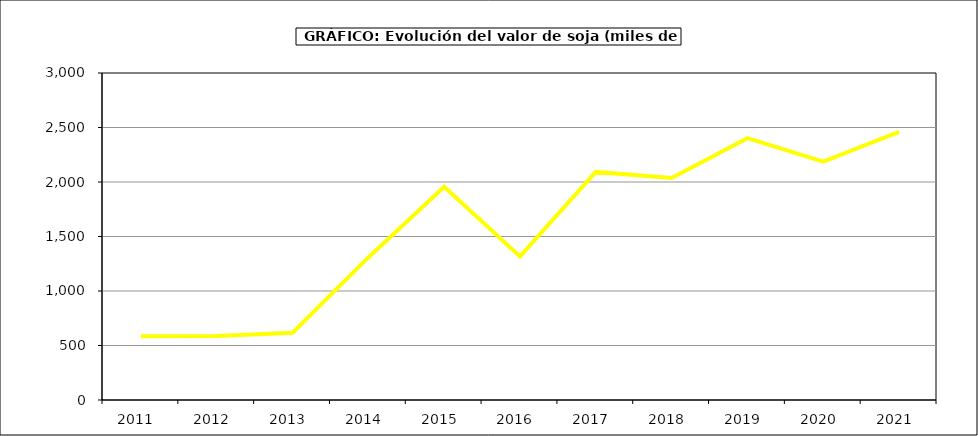
| Category | Valor |
|---|---|
| 2011.0 | 584.814 |
| 2012.0 | 588.253 |
| 2013.0 | 616.743 |
| 2014.0 | 1308.04 |
| 2015.0 | 1956 |
| 2016.0 | 1317 |
| 2017.0 | 2092.786 |
| 2018.0 | 2037.396 |
| 2019.0 | 2402.196 |
| 2020.0 | 2187.061 |
| 2021.0 | 2460.821 |